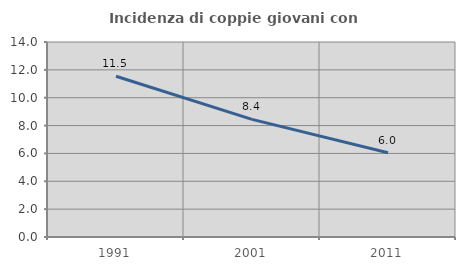
| Category | Incidenza di coppie giovani con figli |
|---|---|
| 1991.0 | 11.538 |
| 2001.0 | 8.444 |
| 2011.0 | 6.05 |